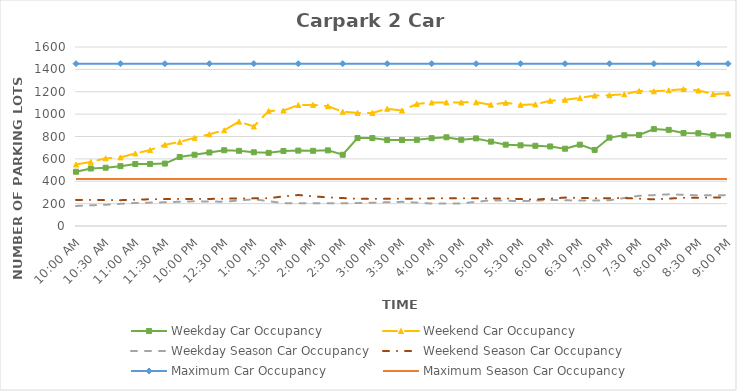
| Category | Weekday Car Occupancy | Weekend Car Occupancy | Weekday Season Car Occupancy | Weekend Season Car Occupancy | Maximum Car Occupancy | Maximum Season Car Occupancy |
|---|---|---|---|---|---|---|
| 0.4166666666666667 | 485 | 550 | 179 | 233 | 1451 | 419 |
| 0.4270833333333333 | 514 | 573 | 185 | 233 | 1451 | 419 |
| 0.4375 | 521 | 605 | 190 | 232 | 1451 | 419 |
| 0.4479166666666667 | 535 | 613 | 198 | 231 | 1451 | 419 |
| 0.4583333333333333 | 554 | 649 | 206 | 235 | 1451 | 419 |
| 0.46875 | 555 | 679 | 209 | 239 | 1451 | 419 |
| 0.4791666666666667 | 558 | 726 | 212 | 241 | 1451 | 419 |
| 0.4895833333333333 | 617 | 752 | 217 | 242 | 1451 | 419 |
| 0.5 | 637 | 788 | 221 | 242 | 1451 | 419 |
| 0.5104166666666666 | 657 | 820 | 219 | 242 | 1451 | 419 |
| 0.5208333333333334 | 677 | 856 | 217 | 244 | 1451 | 419 |
| 0.53125 | 672 | 933 | 228 | 246 | 1451 | 419 |
| 0.5416666666666666 | 659 | 890 | 239 | 247 | 1451 | 419 |
| 0.5520833333333334 | 654 | 1028 | 222 | 248 | 1451 | 419 |
| 0.5625 | 670 | 1032 | 204 | 265 | 1451 | 419 |
| 0.5729166666666666 | 674 | 1081 | 204 | 277 | 1451 | 419 |
| 0.5833333333333334 | 672 | 1083 | 203 | 265 | 1451 | 419 |
| 0.59375 | 676 | 1071 | 203 | 256 | 1451 | 419 |
| 0.604166666666667 | 637 | 1022 | 203 | 250 | 1451 | 419 |
| 0.614583333333333 | 786 | 1011 | 205 | 243 | 1451 | 419 |
| 0.625 | 786 | 1011 | 208 | 243 | 1451 | 419 |
| 0.635416666666666 | 768 | 1048 | 212 | 243 | 1451 | 419 |
| 0.645833333333333 | 768 | 1032 | 216 | 244 | 1451 | 419 |
| 0.65625 | 770 | 1091 | 209 | 245 | 1451 | 419 |
| 0.666666666666666 | 785 | 1104 | 201 | 247 | 1451 | 419 |
| 0.677083333333333 | 793 | 1105 | 201 | 248 | 1451 | 419 |
| 0.6875 | 771 | 1105 | 202 | 248 | 1451 | 419 |
| 0.697916666666666 | 783 | 1106 | 216 | 247 | 1451 | 419 |
| 0.708333333333333 | 754 | 1084 | 230 | 247 | 1451 | 419 |
| 0.718749999999999 | 727 | 1102 | 226 | 246 | 1451 | 419 |
| 0.729166666666666 | 721 | 1083 | 222 | 241 | 1451 | 419 |
| 0.739583333333333 | 717 | 1087 | 226 | 236 | 1451 | 419 |
| 0.75 | 711 | 1120 | 233 | 245 | 1451 | 419 |
| 0.7604166666666666 | 691 | 1128 | 230 | 254 | 1451 | 419 |
| 0.7708333333333334 | 727 | 1145 | 227 | 251 | 1451 | 419 |
| 0.78125 | 680 | 1166 | 228 | 248 | 1451 | 419 |
| 0.7916666666666666 | 790 | 1169 | 230 | 249 | 1451 | 419 |
| 0.8020833333333334 | 811 | 1178 | 250 | 250 | 1451 | 419 |
| 0.8125 | 814 | 1206 | 270 | 244 | 1451 | 419 |
| 0.8229166666666666 | 866 | 1204 | 276 | 238 | 1451 | 419 |
| 0.8333333333333334 | 859 | 1213 | 283 | 245 | 1451 | 419 |
| 0.84375 | 831 | 1223 | 279 | 252 | 1451 | 419 |
| 0.8541666666666666 | 829 | 1212 | 274 | 253 | 1451 | 419 |
| 0.8645833333333334 | 811 | 1179 | 274 | 255 | 1451 | 419 |
| 0.875 | 811 | 1185 | 275 | 255 | 1451 | 419 |